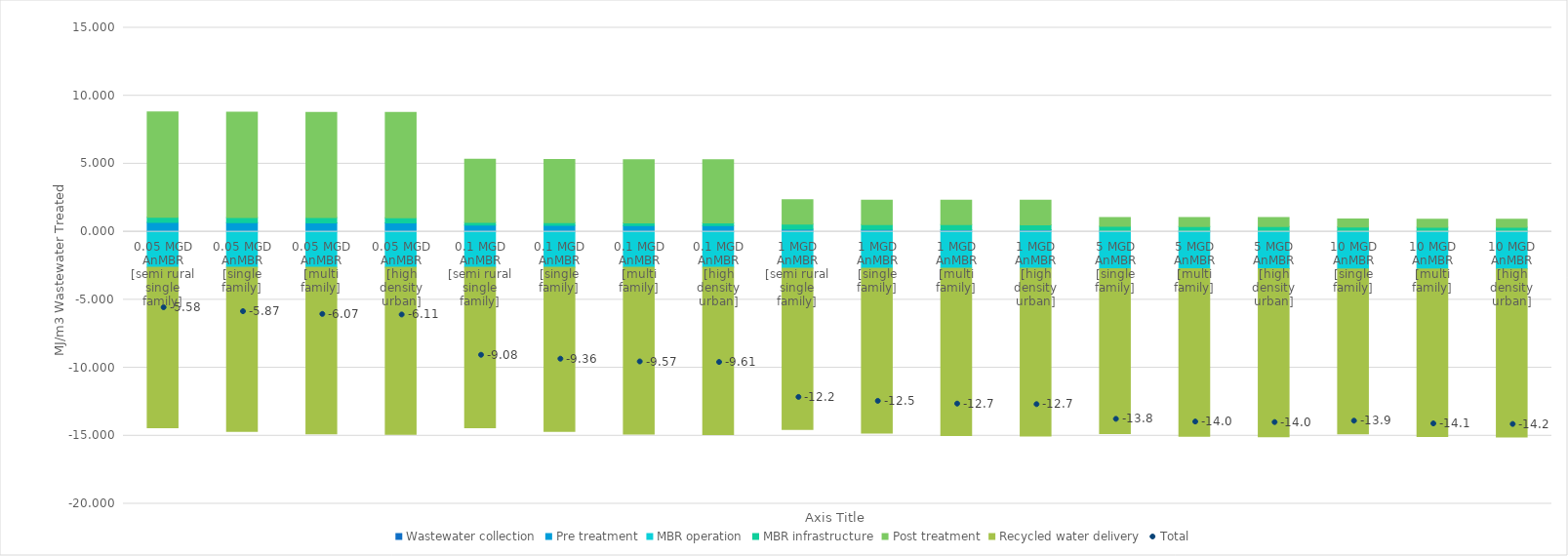
| Category | Wastewater collection | Pre treatment | MBR operation | MBR infrastructure | Post treatment | Recycled water delivery |
|---|---|---|---|---|---|---|
| 0.05 MGD AnMBR [semi rural single family] | 0.04 | 0.65 | -2.609 | 0.387 | 7.739 | -11.791 |
| 0.05 MGD AnMBR [single family] | 0.021 | 0.65 | -2.609 | 0.387 | 7.739 | -12.061 |
| 0.05 MGD AnMBR [multi family] | 0.005 | 0.65 | -2.609 | 0.387 | 7.739 | -12.245 |
| 0.05 MGD AnMBR [high density urban] | 0.003 | 0.65 | -2.609 | 0.387 | 7.739 | -12.284 |
| 0.1 MGD AnMBR [semi rural single family] | 0.038 | 0.452 | -2.609 | 0.199 | 4.643 | -11.803 |
| 0.1 MGD AnMBR [single family] | 0.02 | 0.452 | -2.609 | 0.199 | 4.643 | -12.07 |
| 0.1 MGD AnMBR [multi family] | 0.005 | 0.452 | -2.609 | 0.199 | 4.643 | -12.257 |
| 0.1 MGD AnMBR [high density urban] | 0.003 | 0.452 | -2.609 | 0.199 | 4.643 | -12.295 |
| 1 MGD AnMBR [semi rural single family] | 0.04 | 0.143 | -2.683 | 0.375 | 1.794 | -11.845 |
| 1 MGD AnMBR [single family] | 0.02 | 0.143 | -2.683 | 0.375 | 1.794 | -12.113 |
| 1 MGD AnMBR [multi family] | 0.005 | 0.143 | -2.683 | 0.375 | 1.794 | -12.3 |
| 1 MGD AnMBR [high density urban] | 0.003 | 0.143 | -2.683 | 0.375 | 1.794 | -12.337 |
| 5 MGD AnMBR [single family] | 0.017 | 0.07 | -2.718 | 0.313 | 0.658 | -12.126 |
| 5 MGD AnMBR [multi family] | 0.005 | 0.07 | -2.718 | 0.313 | 0.658 | -12.313 |
| 5 MGD AnMBR [high density urban] | 0.003 | 0.07 | -2.718 | 0.313 | 0.658 | -12.35 |
| 10 MGD AnMBR [single family] | 0.02 | 0.053 | -2.736 | 0.281 | 0.58 | -12.122 |
| 10 MGD AnMBR [multi family] | 0.006 | 0.053 | -2.736 | 0.281 | 0.58 | -12.309 |
| 10 MGD AnMBR [high density urban] | 0.003 | 0.053 | -2.736 | 0.281 | 0.58 | -12.346 |